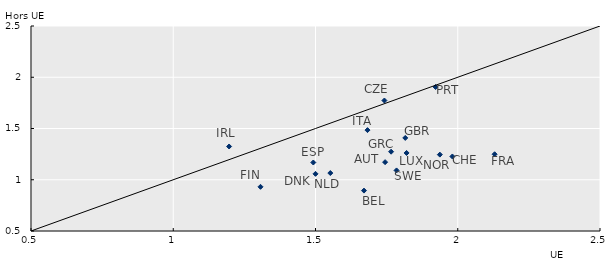
| Category | ratioe_eu |
|---|---|
| 1.74467 | 1.172 |
| 1.670372 | 0.894 |
| 1.981124 | 1.227 |
| 1.742221 | 1.773 |
| 1.500048 | 1.057 |
| 1.492302 | 1.168 |
| 1.306723 | 0.931 |
| 2.129584 | 1.249 |
| 1.815567 | 1.408 |
| 1.765698 | 1.274 |
| 1.196293 | 1.325 |
| 1.682732 | 1.484 |
| 1.820133 | 1.261 |
| 1.552113 | 1.065 |
| 1.937107 | 1.245 |
| 1.922158 | 1.905 |
| 1.784892 | 1.091 |